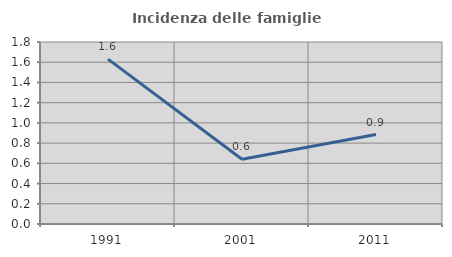
| Category | Incidenza delle famiglie numerose |
|---|---|
| 1991.0 | 1.631 |
| 2001.0 | 0.64 |
| 2011.0 | 0.885 |